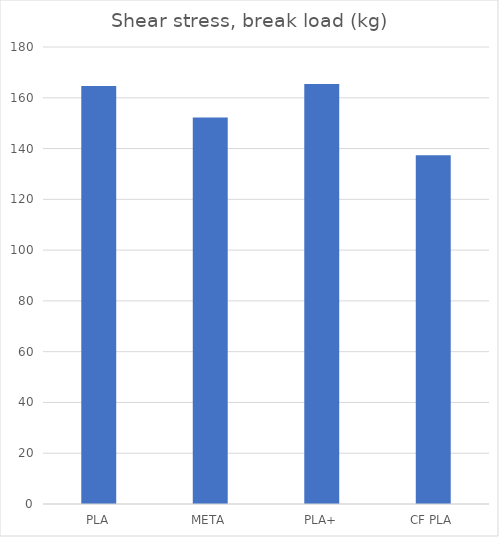
| Category | Break kg |
|---|---|
| PLA | 164.6 |
| META | 152.2 |
| PLA+ | 165.4 |
| CF PLA | 137.4 |